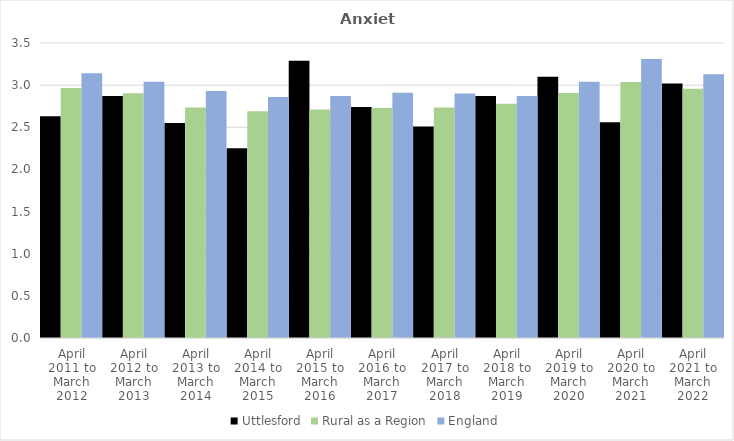
| Category | Uttlesford | Rural as a Region | England |
|---|---|---|---|
| April 2011 to March 2012 | 2.63 | 2.967 | 3.14 |
| April 2012 to March 2013 | 2.87 | 2.904 | 3.04 |
| April 2013 to March 2014 | 2.55 | 2.734 | 2.93 |
| April 2014 to March 2015 | 2.25 | 2.691 | 2.86 |
| April 2015 to March 2016 | 3.29 | 2.711 | 2.87 |
| April 2016 to March 2017 | 2.74 | 2.729 | 2.91 |
| April 2017 to March 2018 | 2.51 | 2.736 | 2.9 |
| April 2018 to March 2019 | 2.87 | 2.78 | 2.87 |
| April 2019 to March 2020 | 3.1 | 2.908 | 3.04 |
| April 2020 to March 2021 | 2.56 | 3.036 | 3.31 |
| April 2021 to March 2022 | 3.02 | 2.956 | 3.13 |